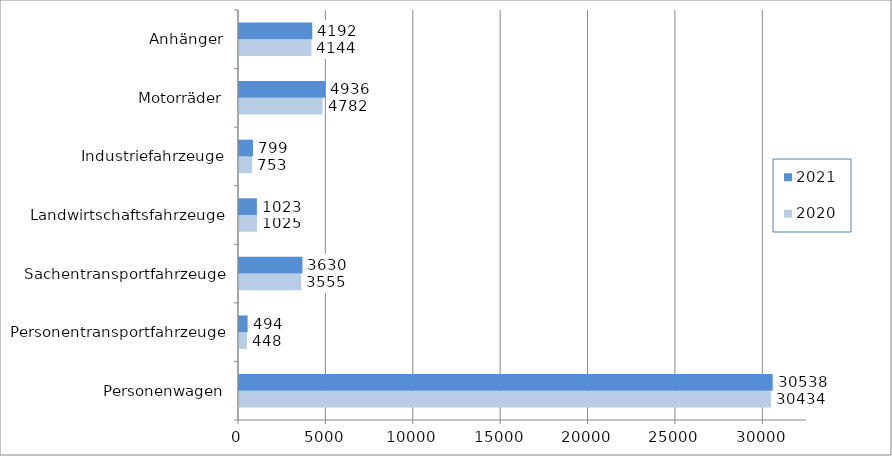
| Category | 2020 | 2021 |
|---|---|---|
| Personenwagen | 30434 | 30538 |
| Personentransportfahrzeuge | 448 | 494 |
| Sachentransportfahrzeuge | 3555 | 3630 |
| Landwirtschaftsfahrzeuge | 1025 | 1023 |
| Industriefahrzeuge | 753 | 799 |
| Motorräder | 4782 | 4936 |
| Anhänger | 4144 | 4192 |